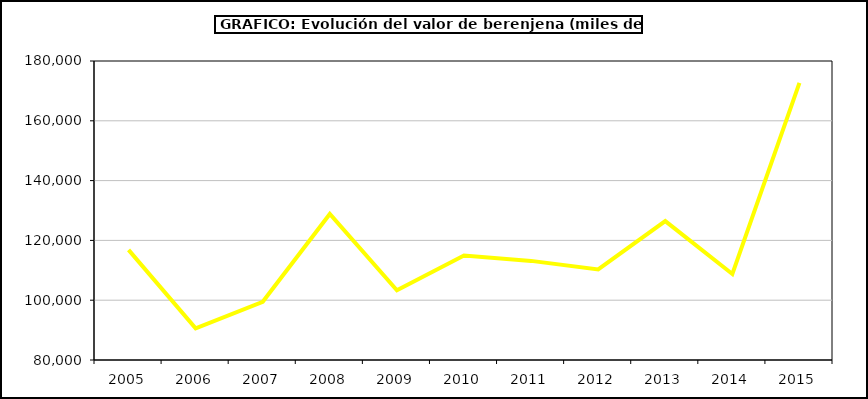
| Category | Valor |
|---|---|
| 2005.0 | 116842.792 |
| 2006.0 | 90580.747 |
| 2007.0 | 99479.743 |
| 2008.0 | 128841.418 |
| 2009.0 | 103302.87 |
| 2010.0 | 114934.838 |
| 2011.0 | 113149.264 |
| 2012.0 | 110271.616 |
| 2013.0 | 126461.496 |
| 2014.0 | 108753.977 |
| 2015.0 | 172694 |